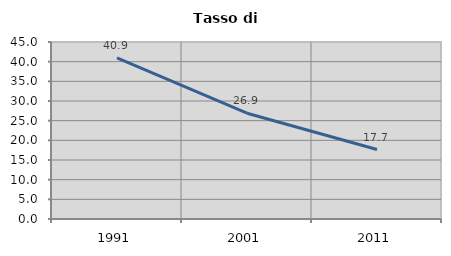
| Category | Tasso di disoccupazione   |
|---|---|
| 1991.0 | 40.948 |
| 2001.0 | 26.896 |
| 2011.0 | 17.667 |